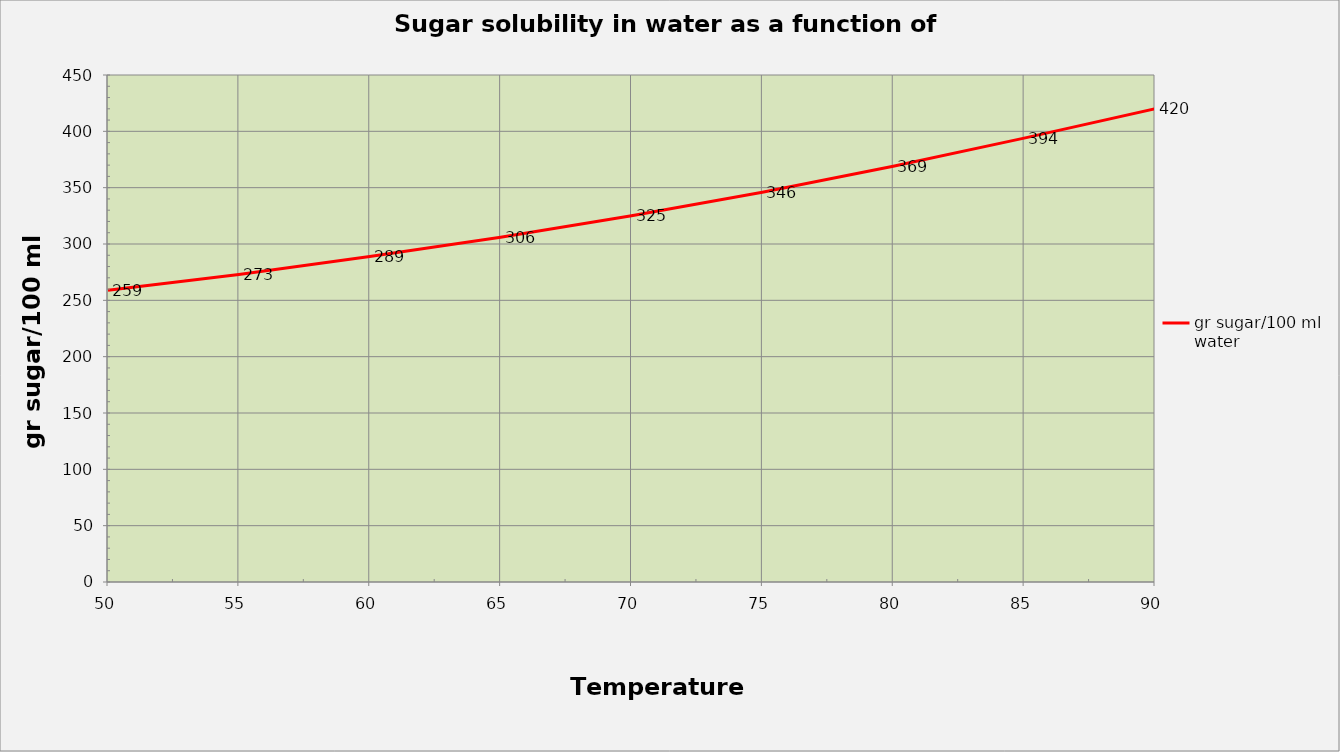
| Category | gr sugar/100 ml water |
|---|---|
| 50.0 | 259 |
| 55.0 | 273 |
| 60.0 | 289 |
| 65.0 | 306 |
| 70.0 | 325 |
| 75.0 | 346 |
| 80.0 | 369 |
| 85.0 | 394 |
| 90.0 | 420 |